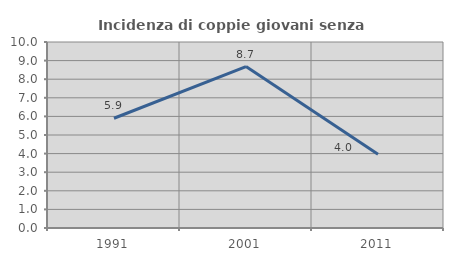
| Category | Incidenza di coppie giovani senza figli |
|---|---|
| 1991.0 | 5.9 |
| 2001.0 | 8.677 |
| 2011.0 | 3.966 |